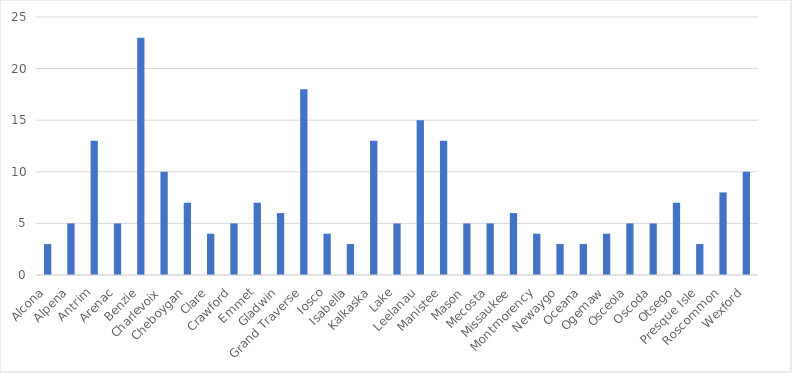
| Category | Number of Responses |
|---|---|
| Alcona | 3 |
| Alpena | 5 |
| Antrim | 13 |
| Arenac | 5 |
| Benzie | 23 |
| Charlevoix | 10 |
| Cheboygan | 7 |
| Clare | 4 |
| Crawford | 5 |
| Emmet | 7 |
| Gladwin | 6 |
| Grand Traverse | 18 |
| Iosco | 4 |
| Isabella | 3 |
| Kalkaska | 13 |
| Lake | 5 |
| Leelanau | 15 |
| Manistee | 13 |
| Mason | 5 |
| Mecosta | 5 |
| Missaukee | 6 |
| Montmorency | 4 |
| Newaygo | 3 |
| Oceana | 3 |
| Ogemaw | 4 |
| Osceola | 5 |
| Oscoda | 5 |
| Otsego | 7 |
| Presque Isle | 3 |
| Roscommon | 8 |
| Wexford | 10 |